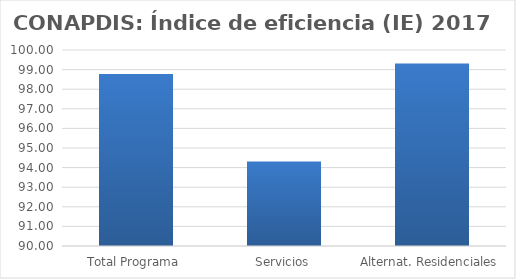
| Category | Índice de eficiencia (IE)  |
|---|---|
| Total Programa | 98.782 |
| Servicios | 94.313 |
| Alternat. Residenciales | 99.311 |